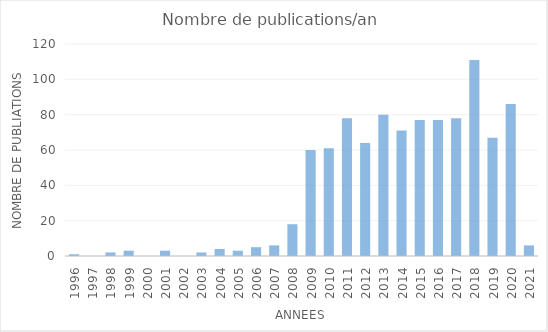
| Category | Series 0 |
|---|---|
| 1996.0 | 1 |
| 1997.0 | 0 |
| 1998.0 | 2 |
| 1999.0 | 3 |
| 2000.0 | 0 |
| 2001.0 | 3 |
| 2002.0 | 0 |
| 2003.0 | 2 |
| 2004.0 | 4 |
| 2005.0 | 3 |
| 2006.0 | 5 |
| 2007.0 | 6 |
| 2008.0 | 18 |
| 2009.0 | 60 |
| 2010.0 | 61 |
| 2011.0 | 78 |
| 2012.0 | 64 |
| 2013.0 | 80 |
| 2014.0 | 71 |
| 2015.0 | 77 |
| 2016.0 | 77 |
| 2017.0 | 78 |
| 2018.0 | 111 |
| 2019.0 | 67 |
| 2020.0 | 86 |
| 2021.0 | 6 |